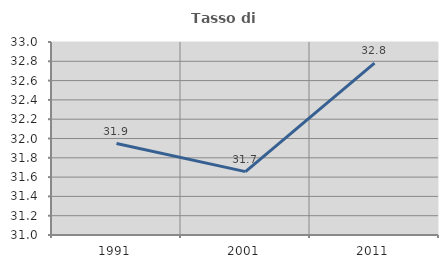
| Category | Tasso di occupazione   |
|---|---|
| 1991.0 | 31.948 |
| 2001.0 | 31.657 |
| 2011.0 | 32.781 |